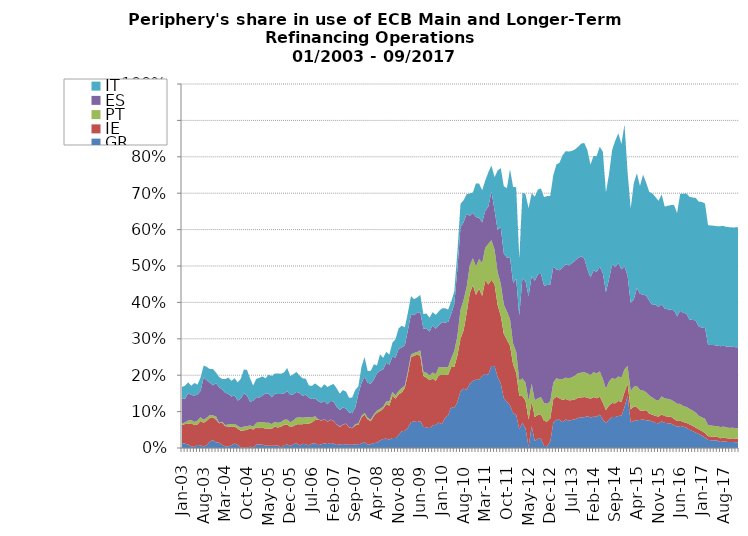
| Category | GR | IE | PT | ES | IT |
|---|---|---|---|---|---|
| 2003-01-01 | 0.014 | 0.05 | 0.003 | 0.07 | 0.031 |
| 2003-02-01 | 0.012 | 0.054 | 0.005 | 0.065 | 0.036 |
| 2003-03-01 | 0.01 | 0.057 | 0.009 | 0.075 | 0.03 |
| 2003-04-01 | 0.005 | 0.063 | 0.009 | 0.069 | 0.025 |
| 2003-05-01 | 0.003 | 0.06 | 0.009 | 0.073 | 0.034 |
| 2003-06-01 | 0.009 | 0.056 | 0.011 | 0.072 | 0.027 |
| 2003-07-01 | 0.007 | 0.067 | 0.01 | 0.073 | 0.037 |
| 2003-08-01 | 0.004 | 0.065 | 0.008 | 0.116 | 0.032 |
| 2003-09-01 | 0.008 | 0.067 | 0.009 | 0.103 | 0.037 |
| 2003-10-01 | 0.018 | 0.065 | 0.008 | 0.089 | 0.037 |
| 2003-11-01 | 0.022 | 0.063 | 0.005 | 0.083 | 0.045 |
| 2003-12-01 | 0.015 | 0.062 | 0.009 | 0.091 | 0.029 |
| 2004-01-01 | 0.014 | 0.054 | 0.001 | 0.098 | 0.028 |
| 2004-02-01 | 0.009 | 0.06 | 0.003 | 0.088 | 0.029 |
| 2004-03-01 | 0.004 | 0.056 | 0.003 | 0.088 | 0.038 |
| 2004-04-01 | 0.005 | 0.054 | 0.006 | 0.085 | 0.044 |
| 2004-05-01 | 0.008 | 0.05 | 0.008 | 0.076 | 0.043 |
| 2004-06-01 | 0.012 | 0.046 | 0.008 | 0.079 | 0.047 |
| 2004-07-01 | 0.009 | 0.044 | 0.008 | 0.069 | 0.05 |
| 2004-08-01 | 0.002 | 0.046 | 0.008 | 0.08 | 0.054 |
| 2004-09-01 | 0 | 0.048 | 0.01 | 0.092 | 0.065 |
| 2004-10-01 | 0.002 | 0.048 | 0.01 | 0.084 | 0.07 |
| 2004-11-01 | 0.003 | 0.051 | 0.008 | 0.065 | 0.064 |
| 2004-12-01 | 0.001 | 0.05 | 0.008 | 0.071 | 0.042 |
| 2005-01-01 | 0.009 | 0.048 | 0.012 | 0.071 | 0.05 |
| 2005-02-01 | 0.01 | 0.045 | 0.017 | 0.068 | 0.054 |
| 2005-03-01 | 0.009 | 0.046 | 0.016 | 0.073 | 0.053 |
| 2005-04-01 | 0.007 | 0.047 | 0.016 | 0.081 | 0.041 |
| 2005-05-01 | 0.006 | 0.048 | 0.016 | 0.08 | 0.052 |
| 2005-06-01 | 0.006 | 0.046 | 0.013 | 0.074 | 0.058 |
| 2005-07-01 | 0.006 | 0.053 | 0.013 | 0.077 | 0.055 |
| 2005-08-01 | 0.007 | 0.049 | 0.013 | 0.079 | 0.056 |
| 2005-09-01 | 0.001 | 0.058 | 0.013 | 0.077 | 0.056 |
| 2005-10-01 | 0.008 | 0.056 | 0.014 | 0.073 | 0.058 |
| 2005-11-01 | 0.01 | 0.055 | 0.014 | 0.078 | 0.064 |
| 2005-12-01 | 0.006 | 0.052 | 0.013 | 0.075 | 0.052 |
| 2006-01-01 | 0.01 | 0.05 | 0.016 | 0.071 | 0.055 |
| 2006-02-01 | 0.013 | 0.052 | 0.019 | 0.071 | 0.055 |
| 2006-03-01 | 0.007 | 0.059 | 0.018 | 0.066 | 0.048 |
| 2006-04-01 | 0.012 | 0.054 | 0.018 | 0.06 | 0.048 |
| 2006-05-01 | 0.01 | 0.056 | 0.018 | 0.062 | 0.044 |
| 2006-06-01 | 0.007 | 0.06 | 0.018 | 0.053 | 0.034 |
| 2006-07-01 | 0.012 | 0.058 | 0.013 | 0.05 | 0.036 |
| 2006-08-01 | 0.013 | 0.064 | 0.011 | 0.049 | 0.041 |
| 2006-09-01 | 0.008 | 0.071 | 0.001 | 0.05 | 0.042 |
| 2006-10-01 | 0.01 | 0.065 | 0 | 0.049 | 0.04 |
| 2006-11-01 | 0.013 | 0.067 | 0 | 0.049 | 0.046 |
| 2006-12-01 | 0.011 | 0.061 | 0 | 0.048 | 0.047 |
| 2007-01-01 | 0.014 | 0.064 | 0 | 0.051 | 0.043 |
| 2007-02-01 | 0.012 | 0.062 | 0 | 0.053 | 0.048 |
| 2007-03-01 | 0.008 | 0.056 | 0 | 0.048 | 0.051 |
| 2007-04-01 | 0.01 | 0.048 | 0.001 | 0.045 | 0.045 |
| 2007-05-01 | 0.011 | 0.053 | 0 | 0.047 | 0.048 |
| 2007-06-01 | 0.009 | 0.057 | 0.001 | 0.041 | 0.047 |
| 2007-07-01 | 0.009 | 0.048 | 0 | 0.041 | 0.04 |
| 2007-08-01 | 0.009 | 0.046 | 0.001 | 0.041 | 0.043 |
| 2007-09-01 | 0.01 | 0.052 | 0.003 | 0.046 | 0.048 |
| 2007-10-01 | 0.01 | 0.054 | 0.003 | 0.081 | 0.021 |
| 2007-11-01 | 0.012 | 0.072 | 0.004 | 0.09 | 0.045 |
| 2007-12-01 | 0.017 | 0.075 | 0.005 | 0.1 | 0.054 |
| 2008-01-01 | 0.009 | 0.069 | 0.004 | 0.096 | 0.032 |
| 2008-02-01 | 0.011 | 0.063 | 0.005 | 0.098 | 0.035 |
| 2008-03-01 | 0.014 | 0.075 | 0.004 | 0.096 | 0.042 |
| 2008-04-01 | 0.015 | 0.082 | 0.006 | 0.102 | 0.022 |
| 2008-05-01 | 0.021 | 0.08 | 0.007 | 0.105 | 0.045 |
| 2008-06-01 | 0.025 | 0.083 | 0.005 | 0.102 | 0.032 |
| 2008-07-01 | 0.026 | 0.095 | 0.007 | 0.106 | 0.03 |
| 2008-08-01 | 0.023 | 0.093 | 0.012 | 0.101 | 0.027 |
| 2008-09-01 | 0.028 | 0.115 | 0.011 | 0.097 | 0.038 |
| 2008-10-01 | 0.027 | 0.108 | 0.009 | 0.104 | 0.051 |
| 2008-11-01 | 0.036 | 0.111 | 0.01 | 0.115 | 0.056 |
| 2008-12-01 | 0.046 | 0.106 | 0.012 | 0.111 | 0.06 |
| 2009-01-01 | 0.047 | 0.117 | 0.007 | 0.11 | 0.05 |
| 2009-02-01 | 0.055 | 0.148 | 0.007 | 0.112 | 0.048 |
| 2009-03-01 | 0.071 | 0.178 | 0.008 | 0.111 | 0.05 |
| 2009-04-01 | 0.073 | 0.181 | 0.007 | 0.104 | 0.044 |
| 2009-05-01 | 0.071 | 0.185 | 0.008 | 0.108 | 0.042 |
| 2009-06-01 | 0.074 | 0.18 | 0.015 | 0.105 | 0.047 |
| 2009-07-01 | 0.058 | 0.14 | 0.012 | 0.119 | 0.04 |
| 2009-08-01 | 0.057 | 0.137 | 0.013 | 0.122 | 0.041 |
| 2009-09-01 | 0.054 | 0.132 | 0.013 | 0.121 | 0.038 |
| 2009-10-01 | 0.062 | 0.129 | 0.017 | 0.13 | 0.036 |
| 2009-11-01 | 0.064 | 0.121 | 0.018 | 0.125 | 0.038 |
| 2009-12-01 | 0.07 | 0.13 | 0.023 | 0.115 | 0.038 |
| 2010-01-01 | 0.066 | 0.135 | 0.021 | 0.124 | 0.038 |
| 2010-02-01 | 0.083 | 0.118 | 0.021 | 0.123 | 0.039 |
| 2010-03-01 | 0.09 | 0.111 | 0.021 | 0.124 | 0.034 |
| 2010-04-01 | 0.113 | 0.109 | 0.024 | 0.122 | 0.034 |
| 2010-05-01 | 0.109 | 0.113 | 0.043 | 0.129 | 0.035 |
| 2010-06-01 | 0.127 | 0.127 | 0.054 | 0.184 | 0.048 |
| 2010-07-01 | 0.156 | 0.145 | 0.079 | 0.227 | 0.064 |
| 2010-08-01 | 0.163 | 0.16 | 0.084 | 0.214 | 0.06 |
| 2010-09-01 | 0.16 | 0.212 | 0.071 | 0.201 | 0.054 |
| 2010-10-01 | 0.177 | 0.249 | 0.077 | 0.136 | 0.061 |
| 2010-11-01 | 0.184 | 0.264 | 0.074 | 0.125 | 0.056 |
| 2010-12-01 | 0.188 | 0.233 | 0.078 | 0.136 | 0.093 |
| 2011-01-01 | 0.187 | 0.25 | 0.081 | 0.113 | 0.094 |
| 2011-02-01 | 0.199 | 0.219 | 0.09 | 0.112 | 0.088 |
| 2011-03-01 | 0.203 | 0.257 | 0.09 | 0.101 | 0.083 |
| 2011-04-01 | 0.202 | 0.247 | 0.112 | 0.102 | 0.095 |
| 2011-05-01 | 0.225 | 0.236 | 0.109 | 0.134 | 0.071 |
| 2011-06-01 | 0.225 | 0.225 | 0.096 | 0.108 | 0.09 |
| 2011-07-01 | 0.195 | 0.198 | 0.09 | 0.116 | 0.163 |
| 2011-08-01 | 0.177 | 0.186 | 0.088 | 0.155 | 0.162 |
| 2011-09-01 | 0.137 | 0.177 | 0.081 | 0.14 | 0.185 |
| 2011-10-01 | 0.127 | 0.17 | 0.078 | 0.148 | 0.191 |
| 2011-11-01 | 0.117 | 0.164 | 0.073 | 0.17 | 0.242 |
| 2011-12-01 | 0.096 | 0.134 | 0.058 | 0.166 | 0.264 |
| 2012-01-01 | 0.091 | 0.115 | 0.058 | 0.201 | 0.252 |
| 2012-02-01 | 0.052 | 0.092 | 0.042 | 0.179 | 0.156 |
| 2012-03-01 | 0.068 | 0.074 | 0.049 | 0.275 | 0.235 |
| 2012-04-01 | 0.055 | 0.076 | 0.049 | 0.279 | 0.239 |
| 2012-05-01 | 0.003 | 0.075 | 0.052 | 0.288 | 0.242 |
| 2012-06-01 | 0.06 | 0.069 | 0.049 | 0.295 | 0.228 |
| 2012-07-31 | 0.02 | 0.065 | 0.046 | 0.328 | 0.231 |
| 2012-08-31 | 0.026 | 0.066 | 0.045 | 0.341 | 0.232 |
| 2012-09-30 | 0.026 | 0.067 | 0.047 | 0.339 | 0.234 |
| 2012-10-31 | 0.006 | 0.069 | 0.049 | 0.322 | 0.243 |
| 2012-11-30 | 0.005 | 0.068 | 0.049 | 0.326 | 0.244 |
| 2012-12-31 | 0.017 | 0.064 | 0.047 | 0.32 | 0.244 |
| 2013-01-31 | 0.07 | 0.064 | 0.046 | 0.318 | 0.252 |
| 2013-02-28 | 0.077 | 0.064 | 0.051 | 0.299 | 0.289 |
| 2013-03-31 | 0.078 | 0.059 | 0.053 | 0.299 | 0.296 |
| 2013-04-30 | 0.071 | 0.061 | 0.058 | 0.307 | 0.308 |
| 2013-05-31 | 0.078 | 0.056 | 0.058 | 0.311 | 0.311 |
| 2013-06-30 | 0.075 | 0.056 | 0.06 | 0.31 | 0.313 |
| 2013-07-31 | 0.077 | 0.054 | 0.062 | 0.314 | 0.308 |
| 2013-08-31 | 0.079 | 0.055 | 0.065 | 0.316 | 0.306 |
| 2013-09-30 | 0.083 | 0.055 | 0.067 | 0.317 | 0.305 |
| 2013-10-31 | 0.084 | 0.055 | 0.068 | 0.319 | 0.31 |
| 2013-11-30 | 0.085 | 0.055 | 0.068 | 0.312 | 0.318 |
| 2013-12-31 | 0.088 | 0.051 | 0.066 | 0.287 | 0.327 |
| 2014-01-31 | 0.084 | 0.051 | 0.065 | 0.268 | 0.31 |
| 2014-02-28 | 0.086 | 0.054 | 0.069 | 0.28 | 0.314 |
| 2014-03-31 | 0.086 | 0.051 | 0.068 | 0.279 | 0.319 |
| 2014-04-30 | 0.092 | 0.049 | 0.07 | 0.288 | 0.329 |
| 2014-05-31 | 0.078 | 0.046 | 0.065 | 0.29 | 0.334 |
| 2014-06-30 | 0.069 | 0.035 | 0.059 | 0.266 | 0.274 |
| 2014-07-31 | 0.078 | 0.039 | 0.066 | 0.281 | 0.289 |
| 2014-08-31 | 0.085 | 0.038 | 0.069 | 0.312 | 0.314 |
| 2014-09-30 | 0.085 | 0.038 | 0.066 | 0.308 | 0.346 |
| 2014-10-31 | 0.088 | 0.041 | 0.067 | 0.311 | 0.357 |
| 2014-11-30 | 0.088 | 0.038 | 0.067 | 0.297 | 0.344 |
| 2014-12-01 | 0.112 | 0.041 | 0.062 | 0.284 | 0.389 |
| 2015-01-31 | 0.143 | 0.033 | 0.049 | 0.248 | 0.285 |
| 2015-02-28 | 0.071 | 0.035 | 0.051 | 0.242 | 0.259 |
| 2015-03-31 | 0.074 | 0.039 | 0.054 | 0.239 | 0.32 |
| 2015-04-30 | 0.076 | 0.036 | 0.058 | 0.269 | 0.315 |
| 2015-05-31 | 0.077 | 0.026 | 0.057 | 0.264 | 0.297 |
| 2015-06-30 | 0.078 | 0.024 | 0.055 | 0.263 | 0.33 |
| 2015-07-31 | 0.076 | 0.028 | 0.049 | 0.266 | 0.31 |
| 2015-08-01 | 0.075 | 0.019 | 0.05 | 0.26 | 0.299 |
| 2015-09-01 | 0.073 | 0.019 | 0.047 | 0.254 | 0.307 |
| 2015-10-01 | 0.069 | 0.019 | 0.045 | 0.261 | 0.296 |
| 2015-11-01 | 0.068 | 0.018 | 0.044 | 0.257 | 0.292 |
| 2015-12-01 | 0.073 | 0.019 | 0.05 | 0.254 | 0.301 |
| 2016-01-01 | 0.069 | 0.019 | 0.048 | 0.247 | 0.28 |
| 2016-02-01 | 0.068 | 0.018 | 0.049 | 0.246 | 0.284 |
| 2016-03-01 | 0.067 | 0.019 | 0.047 | 0.247 | 0.288 |
| 2016-04-01 | 0.063 | 0.017 | 0.048 | 0.25 | 0.29 |
| 2016-05-31 | 0.058 | 0.016 | 0.048 | 0.24 | 0.284 |
| 2016-06-30 | 0.06 | 0.015 | 0.046 | 0.255 | 0.322 |
| 2016-07-31 | 0.059 | 0.013 | 0.043 | 0.256 | 0.327 |
| 2016-08-31 | 0.056 | 0.013 | 0.044 | 0.257 | 0.33 |
| 2016-09-30 | 0.05 | 0.015 | 0.043 | 0.245 | 0.337 |
| 2016-10-31 | 0.046 | 0.015 | 0.042 | 0.249 | 0.336 |
| 2016-11-30 | 0.042 | 0.014 | 0.041 | 0.253 | 0.336 |
| 2016-12-31 | 0.038 | 0.012 | 0.038 | 0.245 | 0.343 |
| 2017-01-31 | 0.034 | 0.012 | 0.038 | 0.246 | 0.346 |
| 2017-02-28 | 0.029 | 0.012 | 0.039 | 0.252 | 0.34 |
| 2017-03-31 | 0.022 | 0.01 | 0.03 | 0.221 | 0.329 |
| 2017-04-30 | 0.021 | 0.01 | 0.03 | 0.221 | 0.328 |
| 2017-05-31 | 0.021 | 0.01 | 0.03 | 0.222 | 0.328 |
| 2017-06-30 | 0.021 | 0.01 | 0.03 | 0.221 | 0.328 |
| 2017-07-31 | 0.017 | 0.01 | 0.031 | 0.222 | 0.33 |
| 2017-08-31 | 0.018 | 0.01 | 0.03 | 0.222 | 0.329 |
| 2017-09-30 | 0.017 | 0.01 | 0.03 | 0.222 | 0.328 |
| 2017-10-31 | 0.016 | 0.01 | 0.029 | 0.223 | 0.329 |
| 2017-11-30 | 0.017 | 0.01 | 0.029 | 0.222 | 0.328 |
| 2017-12-31 | 0.015 | 0.01 | 0.029 | 0.223 | 0.329 |
| 2018-01-31 | 0.015 | 0.01 | 0.029 | 0.223 | 0.329 |